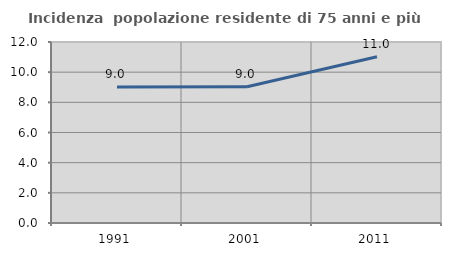
| Category | Incidenza  popolazione residente di 75 anni e più |
|---|---|
| 1991.0 | 9.015 |
| 2001.0 | 9.028 |
| 2011.0 | 11.025 |